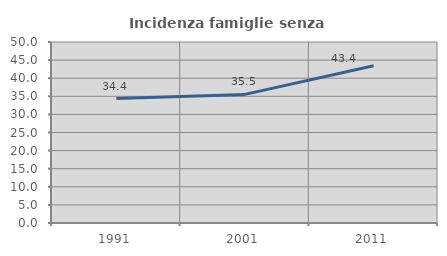
| Category | Incidenza famiglie senza nuclei |
|---|---|
| 1991.0 | 34.375 |
| 2001.0 | 35.526 |
| 2011.0 | 43.421 |